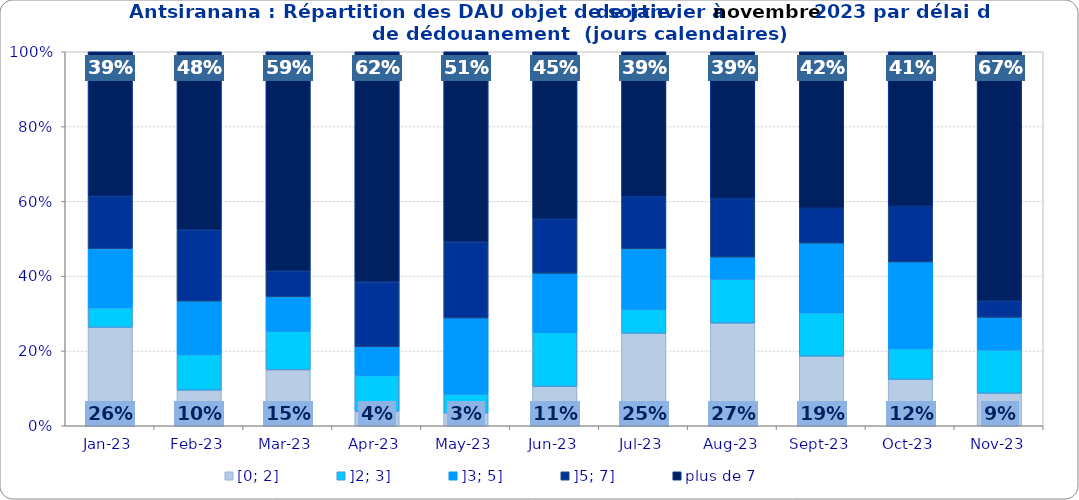
| Category | [0; 2] | ]2; 3] | ]3; 5] | ]5; 7] | plus de 7 |
|---|---|---|---|---|---|
| 2023-01-01 | 0.263 | 0.053 | 0.158 | 0.14 | 0.386 |
| 2023-02-01 | 0.095 | 0.095 | 0.143 | 0.19 | 0.476 |
| 2023-03-01 | 0.149 | 0.103 | 0.092 | 0.069 | 0.586 |
| 2023-04-01 | 0.038 | 0.096 | 0.077 | 0.173 | 0.615 |
| 2023-05-01 | 0.034 | 0.051 | 0.203 | 0.203 | 0.508 |
| 2023-06-01 | 0.105 | 0.145 | 0.158 | 0.145 | 0.447 |
| 2023-07-01 | 0.247 | 0.065 | 0.161 | 0.14 | 0.387 |
| 2023-08-01 | 0.275 | 0.118 | 0.059 | 0.157 | 0.392 |
| 2023-09-01 | 0.186 | 0.116 | 0.186 | 0.093 | 0.419 |
| 2023-10-01 | 0.124 | 0.083 | 0.231 | 0.149 | 0.413 |
| 2023-11-01 | 0.087 | 0.116 | 0.087 | 0.043 | 0.667 |